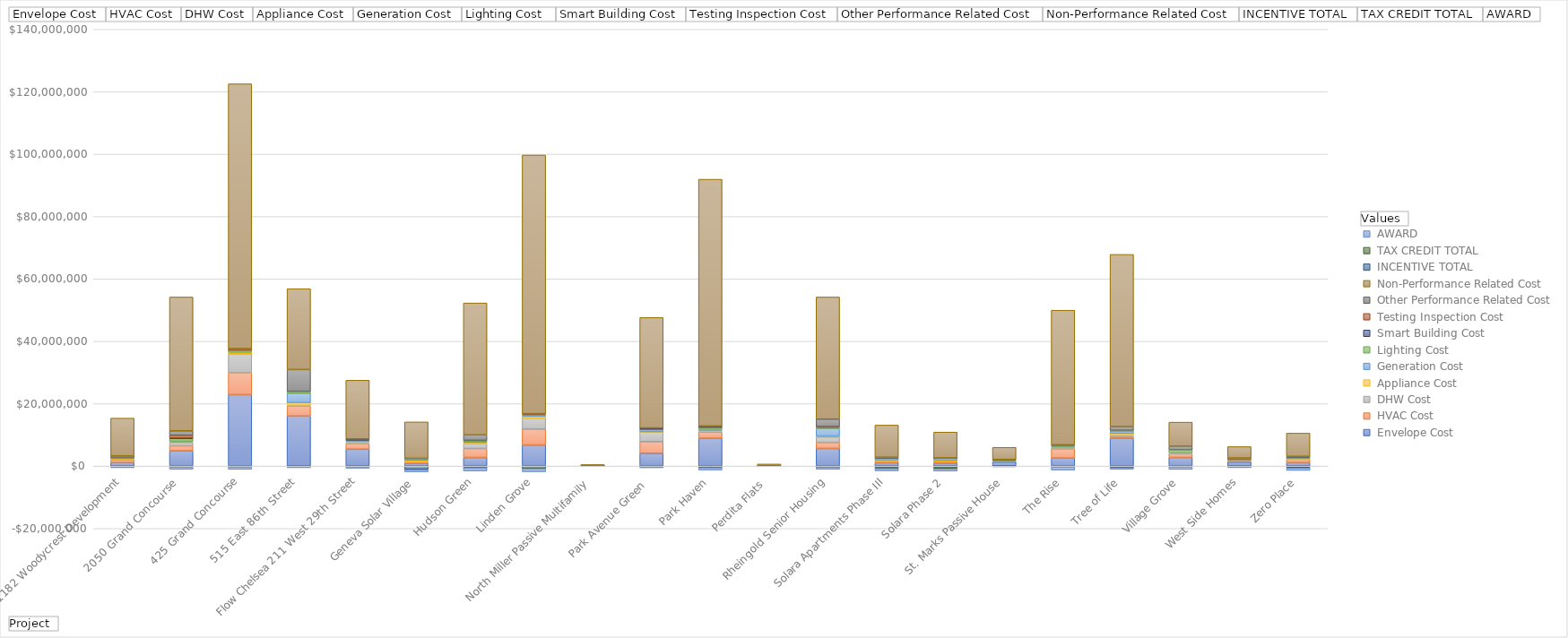
| Category |  Envelope Cost |  HVAC Cost |  DHW Cost |  Appliance Cost |  Generation Cost |  Lighting Cost  |  Smart Building Cost |  Testing Inspection Cost |  Other Performance Related Cost |  Non-Performance Related Cost |  INCENTIVE TOTAL |  TAX CREDIT TOTAL |  AWARD |
|---|---|---|---|---|---|---|---|---|---|---|---|---|---|
| 1182 Woodycrest Development | 1130801.59 | 879051 | 240000 | 140736 | 0 | 200000 | 0 | 0 | 645948 | 12128463.81 | -169700 | 0 | -350931 |
| 2050 Grand Concourse  | 4894107.228 | 1592848.164 | 1059435.67 | 183414 | 239102.25 | 807248.033 | 270000 | 789125 | 1454119.25 | 42899731.587 | -235624 | -55599 | -750000 |
| 425 Grand Concourse | 22898351.84 | 6998906 | 6106206 | 434701 | 0 | 617156 | 0 | 546700 | 50300 | 84887679.16 | -300000 | 0 | -750000 |
| 515 East 86th Street  | 16052777 | 3168000 | 307000 | 788116 | 3072683 | 553272 | 0 | 0 | 7001039.706 | 25917381.706 | -99617.8 | 0 | -425000 |
| Flow Chelsea 211 West 29th Street | 5414207.77 | 1755748.5 | 356582 | 462963.94 | 157000 | 246715.67 | 50000 | 53050 | 198249.76 | 18820784.21 | -145660 | -49394 | -500000 |
| Geneva Solar Village | 823994 | 520783 | 73950 | 410325 | 571158 | 41511 | 0 | 0 | 64637.931 | 11648847 | -978000 | -140885 | -727236 |
| Hudson Green | 2761816 | 2870000 | 1545000 | 372200 | 411400 | 260000 | 0 | 37000 | 1742800 | 42282722 | -555000 | 0 | -1000000 |
| Linden Grove | 6779865.441 | 5074592.04 | 3559889.291 | 572717.547 | 232500 | 400000 | 0 | 189900 | 0 | 82895592.98 | -700000 | -100000 | -1000000 |
| North Miller Passive Multifamily | 96977.91 | 8539.65 | 5400 | 7000 | 27815 | 2147.13 | 2300 | 7650 | 5000 | 289777.66 | -12600 | -14255 | -39467 |
| Park Avenue Green  | 4079691.16 | 3770484.94 | 3048214.42 | 63526 | 682830 | 141119.7 | 365000 | 73675 | 0 | 35399236.42 | -270600 | -20400 | -250000 |
| Park Haven | 8918168 | 2028100 | 91500 | 404336 | 339261 | 590723 | 350000 | 45775 | 100000 | 79083917 | -508200 | 0 | -750000 |
| Perdita Flats  | 64925.8 | 30000 | 12400 | 21000 | 34600 | 750 | 0 | 0 | 0 | 500484.2 | -6400 | -14933 | -59976 |
| Rheingold Senior Housing | 5651719.02 | 1830400 | 1791250 | 239216.96 | 2535918.75 | 294500 | 0 | 310000 | 2405000 | 39136690.99 | -339240 | -52250 | -637500 |
| Solara Apartments Phase III | 1057815 | 575523 | 60000 | 233256 | 678000 | 51000 | 45000 | 22372 | 131321 | 10287092 | -558250 | -199800 | -750000 |
| Solara Phase 2 | 884237 | 575523 | 60000 | 299400 | 678000 | 51000 | 45000 | 20826 | 0 | 8280460 | -571050 | -283035 | -750000 |
| St. Marks Passive House | 1286500 | 275000 | 105000 | 120000 | 40000 | 80000 | 0 | 0 | 186730 | 3887850 | -13608 | -29906 | -203082 |
| The Rise | 2579052 | 2922400 | 300000 | 212800 | 273845 | 280000 | 0 | 0 | 260966 | 43128939.45 | -279680 | 0 | -1000000 |
| Tree of Life | 8908493.25 | 366127.83 | 575000 | 625000 | 679194.51 | 300000 | 0 | 0 | 1195947.3 | 55205071.24 | -320000 | -185526 | -500000 |
| Village Grove | 2770500 | 1174200 | 320280 | 30642.95 | 0 | 888684 | 0 | 0 | 1189475 | 7697481.89 | -274000 | 0 | -792438 |
| West Side Homes | 1283405.21 | 415414.84 | 213378.98 | 32298.56 | 119136.74 | 301510.08 | 0 | 500 | 224844.694 | 3646134.94 | -115819 | -27878 | -362620 |
| Zero Place | 1101500 | 1100000 | 50000 | 110630 | 475000 | 10000 | 215000 | 45000 | 0 | 7440183 | -315040 | -313400 | -750000 |